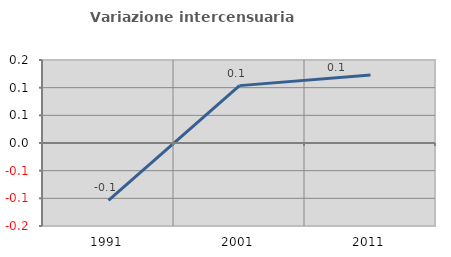
| Category | Variazione intercensuaria annua |
|---|---|
| 1991.0 | -0.104 |
| 2001.0 | 0.104 |
| 2011.0 | 0.123 |